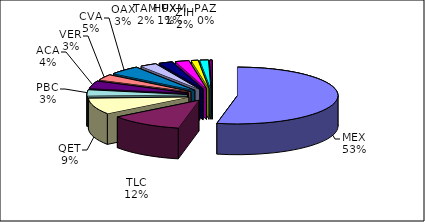
| Category | Series 0 |
|---|---|
| MEX | 262625 |
| TLC | 57989 |
| QET | 45749 |
| PBC | 16417 |
| ACA | 20718 |
| VER | 15581 |
| CVA | 24994 |
| OAX | 13209 |
| TAM | 10931 |
| ZIH | 10835 |
| HUX | 5297 |
| PXM | 6625 |
| PAZ | 1869 |